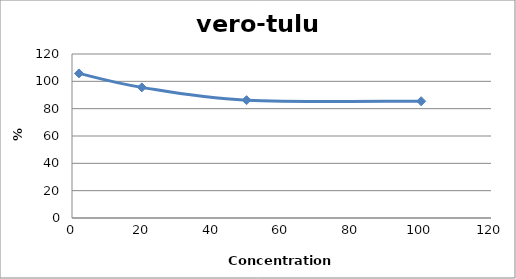
| Category | vero-tulu4 |
|---|---|
| 100.0 | 85.452 |
| 50.0 | 86.22 |
| 20.0 | 95.588 |
| 2.0 | 105.811 |
| nan | 0 |
| nan | 0 |
| nan | 0 |
| nan | 0 |
| nan | 0 |